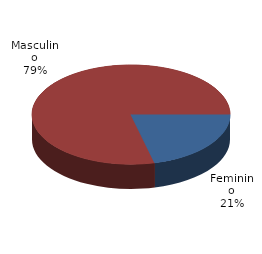
| Category | Qtde Vítimas |
|---|---|
| Feminino | 367 |
| Masculino | 1368 |